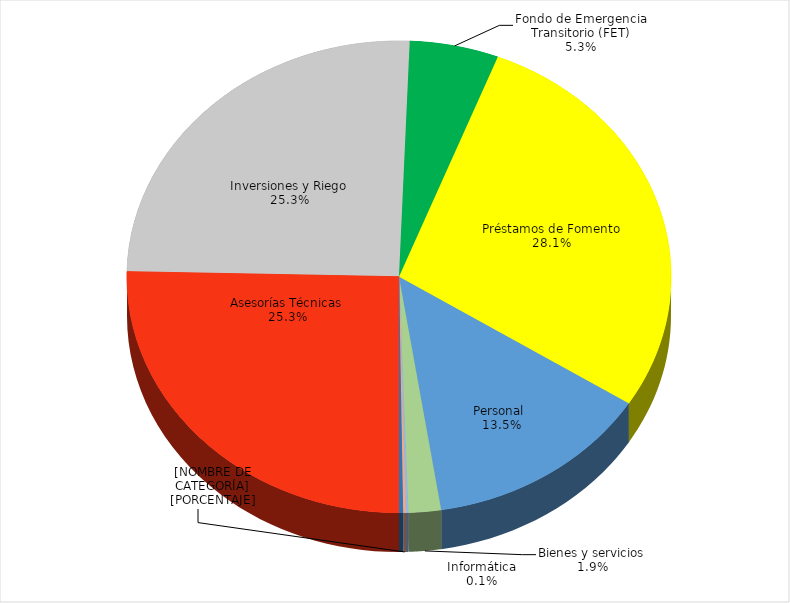
| Category | Series 0 |
|---|---|
| Asesorías Técnicas | 84618137 |
| Inversiones y Riego | 84418854 |
| Fondo de Emergencia Transitorio (FET) | 17644618 |
| Préstamos de Fomento | 93815157 |
| Personal  | 45099606 |
| Bienes y servicios | 6423224 |
| Informática | 478852 |
| Vehículos | 564282 |
| Integros al Fisco y Otros | 810791 |